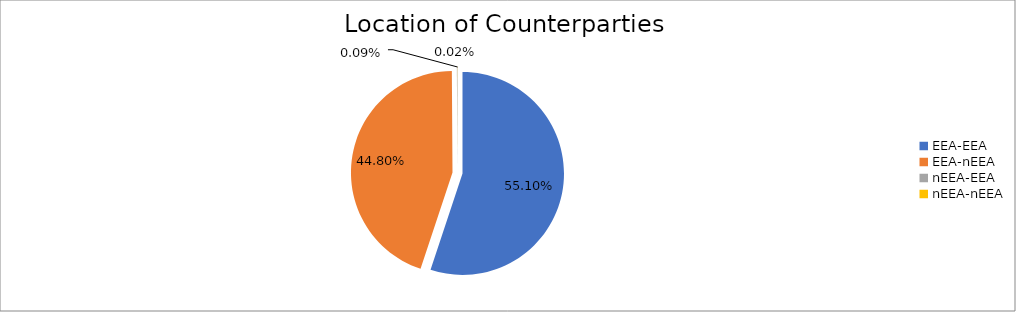
| Category | Series 0 |
|---|---|
| EEA-EEA | 7306709.022 |
| EEA-nEEA | 5941190.745 |
| nEEA-EEA | 11405.6 |
| nEEA-nEEA | 2159.502 |